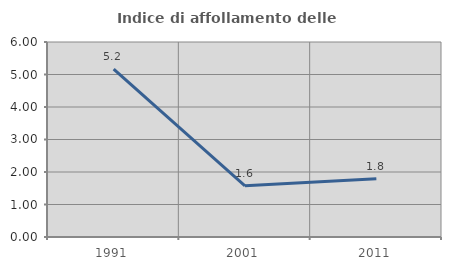
| Category | Indice di affollamento delle abitazioni  |
|---|---|
| 1991.0 | 5.162 |
| 2001.0 | 1.576 |
| 2011.0 | 1.789 |